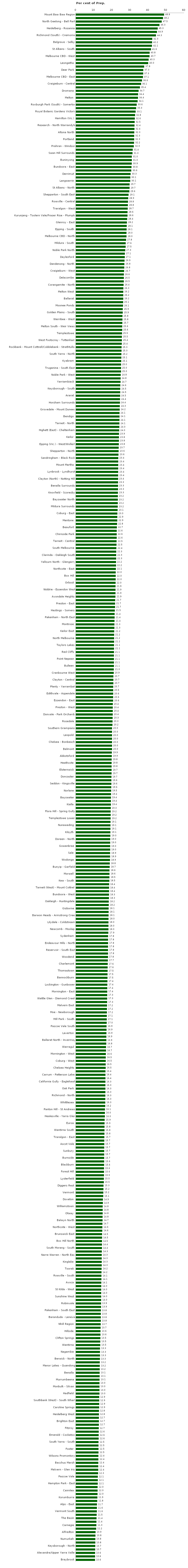
| Category | Series 0 |
|---|---|
| Mount Baw Baw Region | 48.81 |
| Mordialloc - Parkdale/Braeside | 48.214 |
| North Geelong - Bell Park | 47.5 |
| Camperdown | 46.256 |
| Heidelberg - Rosanna | 45.283 |
| Craigieburn - North/Craigieburn - North West | 44.882 |
| Richmond (South) - Cremorne | 44.318 |
| Camberwell | 42.268 |
| Belgrave - Selby | 42.188 |
| Armadale | 42.105 |
| St Albans - South | 41.573 |
| Newport | 40.816 |
| Melbourne CBD - West | 40.741 |
| Shepparton Surrounds - East | 40.254 |
| Leongatha | 40 |
| Castlemaine Surrounds | 37.778 |
| Deer Park | 37.288 |
| Brookfield | 37.255 |
| Melbourne CBD - East | 37.131 |
| Glenroy - West | 36.598 |
| Craigieburn - Central | 36.098 |
| Ararat Surrounds | 35.443 |
| Dromana | 34.694 |
| Springvale South | 34.426 |
| Melton | 34.375 |
| Maryborough Surrounds | 34.146 |
| Roxburgh Park (South) - Somerton | 33.641 |
| Surrey Hills (East) - Mont Albert | 33.333 |
| Royal Botanic Gardens Victoria | 33.058 |
| Mount Dandenong - Olinda | 32.759 |
| Hamilton (Vic.) | 32.609 |
| Hawthorn - North | 32.517 |
| Research - North Warrandyte | 32.432 |
| Werribee - East | 32.418 |
| Altona North | 32.308 |
| West Wodonga | 32.258 |
| Portland | 32.258 |
| St Kilda - Central | 32.178 |
| Prahran - Windsor | 32.039 |
| Maiden Gully | 31.443 |
| Swan Hill Surrounds | 31.325 |
| Meadow Heights | 30.952 |
| Buninyong | 30.952 |
| Dandenong - South | 30.916 |
| Bundoora - East | 30.769 |
| Mount Eliza | 30.645 |
| Derrimut | 30.263 |
| Glen Iris - East | 30.102 |
| Langwarrin | 30.07 |
| Yackandandah | 29.719 |
| St Albans - North | 29.714 |
| Bendigo Surrounds - North | 29.586 |
| Shepparton - South East | 29.148 |
| Dandenong North | 28.947 |
| Rowville - Central | 28.846 |
| Clifton Hill - Alphington | 28.767 |
| Traralgon - West | 28.682 |
| Phillip Island | 28.571 |
| Kurunjang - Toolern Vale/Fraser Rise - Plumpton | 28.571 |
| Carlton North - Princes Hill | 28.378 |
| Glenroy - East | 28.235 |
| Taylors Hill | 28.125 |
| Epping - South | 28.07 |
| Tarneit - South | 28 |
| Melbourne CBD - North | 28 |
| Yea | 27.778 |
| Mildura - South | 27.556 |
| Croydon - West | 27.536 |
| Noble Park North | 27.315 |
| Cranbourne | 27.103 |
| Daylesford | 27.059 |
| Seymour Surrounds | 26.923 |
| Dandenong - North | 26.829 |
| Ormond - Glen Huntly | 26.786 |
| Craigieburn - West | 26.689 |
| Hoppers Crossing - South | 26.556 |
| Delacombe | 26.538 |
| Moira | 26.531 |
| Corangamite - North | 26.389 |
| Sunshine North | 26.271 |
| Melton West | 26.222 |
| Epping - East | 26.22 |
| Ballarat | 26.22 |
| Kensington (Vic.) | 26.144 |
| Moonee Ponds | 26.087 |
| Rochester/Rushworth | 25.926 |
| Golden Plains - South | 25.926 |
| Point Cook - North East | 25.773 |
| Werribee - West | 25.758 |
| Springvale | 25.714 |
| Melton South - Weir Views | 25.641 |
| Thornbury | 25.628 |
| Templestowe | 25.532 |
| Ferntree Gully - North | 25.455 |
| West Footscray - Tottenham | 25.444 |
| Lorne - Anglesea | 25.397 |
| Rockbank - Mount Cottrell/Cobblebank - Strathtulloh | 25.275 |
| Wonthaggi - Inverloch | 25.253 |
| South Yarra - North | 25.17 |
| Colac Surrounds | 25.15 |
| Kyabram | 25.091 |
| Wheelers Hill | 25 |
| Truganina - South East | 25 |
| Flemington Racecourse | 25 |
| Noble Park - West | 24.786 |
| Doncaster East - North | 24.762 |
| Yarriambiack | 24.706 |
| Drouin | 24.576 |
| Keysborough - South | 24.528 |
| Golden Plains - North | 24.528 |
| Ararat | 24.476 |
| Pakenham - North West | 24.409 |
| Horsham Surrounds | 24.39 |
| Tullamarine/Melbourne Airport | 24.289 |
| Grovedale - Mount Duneed | 24.242 |
| Trafalgar (Vic.) | 24.138 |
| Bendigo | 24.138 |
| Cranbourne North - West/Clyde North - South/Clyde North - North/Cranbourne North - East | 24.107 |
| Tarneit - North | 24.065 |
| Castlemaine | 24.042 |
| Highett (East) - Cheltenham | 23.952 |
| Brunswick - North | 23.864 |
| Keilor | 23.83 |
| Brighton (Vic.) | 23.81 |
| Epping (Vic.) - West/Wollert | 23.762 |
| Cranbourne East - North/Cranbourne East - South | 23.676 |
| Shepparton - North | 23.636 |
| Frankston South | 23.556 |
| Sandringham - Black Rock | 23.445 |
| Aspendale Gardens - Waterways | 23.445 |
| Mount Martha | 23.438 |
| Warrandyte - Wonga Park | 23.415 |
| Lynbrook - Lyndhurst | 23.404 |
| Hallam | 23.377 |
| Clayton (North) - Notting Hill | 23.364 |
| Frankston | 23.333 |
| Benalla Surrounds | 23.333 |
| Narre Warren North | 23.313 |
| Knoxfield - Scoresby | 23.256 |
| Mansfield (Vic.) | 23.226 |
| Bayswater North | 23.214 |
| Bundoora - North | 23.171 |
| Mildura Surrounds | 23.153 |
| South Morang - North | 23.077 |
| Coburg - East | 22.951 |
| Werribee - South | 22.917 |
| Mentone | 22.903 |
| Geelong West - Hamlyn Heights | 22.794 |
| Beaufort | 22.672 |
| Craigieburn - South | 22.588 |
| Chirnside Park | 22.581 |
| Airport West/Essendon Airport | 22.581 |
| Tarneit - Central | 22.5 |
| Kyneton | 22.481 |
| South Melbourne | 22.381 |
| Delahey | 22.33 |
| Clarinda - Oakleigh South | 22.293 |
| Doncaster East - South | 22.286 |
| Yallourn North - Glengarry | 22.222 |
| Corangamite - South | 22.222 |
| Northcote - East | 22.115 |
| Horsham | 22.028 |
| Box Hill | 22.026 |
| Pakenham - South West | 22 |
| Orbost | 21.973 |
| Bruthen - Omeo | 21.93 |
| Niddrie - Essendon West | 21.918 |
| Fitzroy North | 21.918 |
| Avondale Heights | 21.875 |
| Loddon | 21.739 |
| Preston - East | 21.687 |
| Sunshine | 21.678 |
| Hastings - Somers | 21.538 |
| South Yarra - West | 21.429 |
| Pakenham - North East | 21.429 |
| Mildura - North | 21.368 |
| Montrose | 21.32 |
| Rosebud - McCrae | 21.311 |
| Keilor East | 21.212 |
| Reservoir - North West | 21.168 |
| North Melbourne | 21.154 |
| Montmorency - Briar Hill | 21.154 |
| Taylors Lakes | 21.101 |
| Hoppers Crossing - North | 21.101 |
| Red Cliffs | 21.081 |
| Truganina - South West | 21.053 |
| Point Nepean | 21.053 |
| Colac | 21.053 |
| Bulleen | 21.053 |
| Upwey - Tecoma | 20.968 |
| Cranbourne West | 20.946 |
| Bright - Mount Beauty | 20.745 |
| Clayton - Central | 20.741 |
| Frankston North | 20.737 |
| Plenty - Yarrambat | 20.661 |
| Yarra Valley | 20.635 |
| Edithvale - Aspendale | 20.635 |
| Corio - Lovely Banks | 20.619 |
| Essendon - East | 20.594 |
| Yarram/Longford - Loch Sport | 20.43 |
| Preston - West | 20.408 |
| Hampton | 20.408 |
| Donvale - Park Orchards | 20.388 |
| Mitcham (Vic.) | 20.325 |
| Rosedale | 20.29 |
| Hampton Park - West | 20.219 |
| Southern Grampians | 20 |
| Smythes Creek | 20 |
| Leopold | 20 |
| Kew East | 20 |
| Chelsea - Bonbeach | 20 |
| Canadian - Mount Clear | 20 |
| Belmont | 20 |
| Kingsbury | 19.886 |
| Abbotsford | 19.857 |
| Lalor - West | 19.792 |
| Heathcote | 19.753 |
| Burwood East | 19.753 |
| Elsternwick | 19.745 |
| Glenelg (Vic.) | 19.731 |
| Doncaster | 19.672 |
| Point Cook - South | 19.635 |
| Seddon - Kingsville | 19.632 |
| Narre Warren South - West | 19.565 |
| Norlane | 19.512 |
| Clayton South | 19.444 |
| Bayswater | 19.403 |
| Sunbury - West | 19.375 |
| Kialla | 19.375 |
| Ringwood | 19.298 |
| Flora Hill - Spring Gully | 19.231 |
| Croydon Hills - Warranwood | 19.231 |
| Templestowe Lower | 19.205 |
| Pearcedale - Tooradin | 19.149 |
| Nunawading | 19.118 |
| Creswick - Clunes | 19.11 |
| Kilsyth | 19.075 |
| Torquay | 19.048 |
| Doreen - North | 18.987 |
| Truganina - North | 18.974 |
| Gowanbrae | 18.966 |
| Collingwood | 18.966 |
| Sale | 18.919 |
| Hughesdale | 18.919 |
| Wodonga | 18.868 |
| Yarraville | 18.75 |
| Bunyip - Garfield | 18.692 |
| Yarrawonga | 18.571 |
| Morwell | 18.571 |
| East Melbourne | 18.543 |
| Kew - South | 18.519 |
| Cranbourne South | 18.4 |
| Tarneit (West) - Mount Cottrell | 18.367 |
| Bentleigh East - South | 18.354 |
| Bundoora - West | 18.333 |
| Gordon (Vic.) | 18.293 |
| Oakleigh - Huntingdale | 18.182 |
| Kerang | 18.182 |
| Gisborne | 18.107 |
| Lalor - East | 18.103 |
| Barwon Heads - Armstrong Creek | 18.072 |
| Endeavour Hills - South | 18.033 |
| Lilydale - Coldstream | 18.023 |
| Kilmore - Broadford | 18.018 |
| Newcomb - Moolap | 18.008 |
| Gladstone Park - Westmeadows | 17.937 |
| Sydenham | 17.808 |
| Reservoir - South West | 17.808 |
| Endeavour Hills - North | 17.797 |
| Lara | 17.785 |
| Reservoir - South East | 17.778 |
| Kings Park (Vic.) | 17.778 |
| Woodend | 17.769 |
| Mickleham - Yuroke | 17.68 |
| Charlemont | 17.61 |
| Churchill | 17.557 |
| Thomastown | 17.544 |
| Ardeer - Albion | 17.5 |
| Bannockburn | 17.48 |
| Ringwood North | 17.442 |
| Lockington - Gunbower | 17.391 |
| Mooroopna | 17.355 |
| Mornington - East | 17.352 |
| Doreen - South | 17.329 |
| Wattle Glen - Diamond Creek | 17.308 |
| Point Lonsdale - Queenscliff | 17.287 |
| Malvern East | 17.219 |
| Ocean Grove | 17.181 |
| Moe - Newborough | 17.157 |
| Balwyn | 17.098 |
| Mill Park - South | 17.073 |
| Seymour | 17.037 |
| Pascoe Vale South | 16.949 |
| Carlton | 16.949 |
| Laverton | 16.883 |
| Narre Warren - South West | 16.854 |
| Ballarat North - Invermay | 16.854 |
| Point Cook - North West | 16.81 |
| Warragul | 16.667 |
| Mill Park - North | 16.667 |
| Mornington - West | 16.564 |
| Mulgrave | 16.514 |
| Coburg - West | 16.514 |
| Footscray | 16.484 |
| Chelsea Heights | 16.477 |
| Skye - Sandhurst | 16.364 |
| Carrum - Patterson Lakes | 16.358 |
| Cobram | 16.352 |
| California Gully - Eaglehawk | 16.34 |
| Somerville | 16.327 |
| Oak Park | 16.327 |
| Eynesbury - Exford | 16.327 |
| Richmond - North | 16.292 |
| Warrnambool - South | 16.268 |
| Whittlesea | 16.256 |
| Berwick - South West | 16.226 |
| Panton Hill - St Andrews | 16.082 |
| Burnside Heights | 16.049 |
| Healesville - Yarra Glen | 16.026 |
| Croydon South | 15.909 |
| Euroa | 15.854 |
| Stawell/St Arnaud | 15.833 |
| Wantirna South | 15.823 |
| Keilor Downs | 15.789 |
| Traralgon - East | 15.741 |
| Wyndham Vale - South | 15.714 |
| Ascot Vale | 15.714 |
| Macedon | 15.686 |
| Sunbury | 15.672 |
| Wandin - Seville | 15.658 |
| Burnside | 15.652 |
| Ringwood East | 15.64 |
| Blackburn | 15.607 |
| Shepparton Surrounds - West | 15.556 |
| Forest Hill | 15.556 |
| Blackburn South | 15.546 |
| Lysterfield | 15.473 |
| Elwood | 15.472 |
| Diggers Rest | 15.271 |
| Ferntree Gully (South) - Upper Ferntree | 15.244 |
| Vermont | 15.179 |
| East Bendigo - Kennington | 15.135 |
| Doveton | 14.943 |
| Alphington - Fairfield | 14.935 |
| Williamstown | 14.815 |
| Romsey | 14.815 |
| Otway | 14.815 |
| Paynesville | 14.754 |
| Balwyn North | 14.744 |
| Highett (West) - Cheltenham | 14.683 |
| Northcote - West | 14.65 |
| Rowville - North | 14.599 |
| Brunswick East | 14.493 |
| Beaconsfield - Officer | 14.493 |
| Box Hill North | 14.451 |
| Strathfieldsaye | 14.423 |
| South Morang - South | 14.423 |
| Berwick - South East | 14.34 |
| Narre Warren - North East | 14.286 |
| Moyne - East | 14.286 |
| Kinglake | 14.286 |
| Caulfield - North | 14.286 |
| Toorak | 14.208 |
| Ashwood - Chadstone | 14.167 |
| Rowville - South | 14.13 |
| Mount Waverley - South | 14.118 |
| Avoca | 14.062 |
| Mernda - North/Mernda - South | 14.035 |
| St Kilda - West | 14 |
| Bentleigh - McKinnon | 14 |
| Sunshine West | 13.986 |
| Beaumaris | 13.953 |
| Robinvale | 13.934 |
| Sebastopol - Redan | 13.918 |
| Pakenham - South East | 13.821 |
| Myrtleford | 13.793 |
| Baranduda - Leneva | 13.793 |
| Ballarat East - Warrenheip | 13.793 |
| Nhill Region | 13.71 |
| White Hills - Ascot | 13.659 |
| Hillside | 13.596 |
| Caulfield - South | 13.58 |
| Clifton Springs | 13.542 |
| Ivanhoe | 13.483 |
| Wantirna | 13.462 |
| Roxburgh Park - North | 13.333 |
| Nagambie | 13.333 |
| Bairnsdale | 13.333 |
| Berwick - North | 13.298 |
| Seaford (Vic.) | 13.208 |
| Manor Lakes - Quandong | 13.208 |
| Sunbury - South | 13.174 |
| Benalla | 13.139 |
| Docklands | 13.131 |
| Murrumbeena | 13.08 |
| Wangaratta | 13.043 |
| Monbulk - Silvan | 13.043 |
| Koo Wee Rup | 13.043 |
| Hadfield | 13.043 |
| Warrnambool - North | 12.903 |
| Southbank (West) - South Wharf | 12.903 |
| Brunswick - South | 12.903 |
| Caroline Springs | 12.883 |
| Brunswick West | 12.766 |
| Heidelberg West | 12.755 |
| Burwood (Vic.) | 12.727 |
| Brighton East | 12.727 |
| Mooroolbark | 12.712 |
| Fitzroy | 12.651 |
| Ashburton (Vic.) | 12.637 |
| Emerald - Cockatoo | 12.593 |
| Altona Meadows | 12.583 |
| South Yarra - South | 12.5 |
| Kew - West | 12.5 |
| Foster | 12.5 |
| Carrum Downs | 12.5 |
| Wilsons Promontory | 12.435 |
| Port Melbourne/Port Melbourne Industrial | 12.422 |
| Bacchus Marsh | 12.403 |
| Wyndham Vale - North | 12.371 |
| Malvern - Glen Iris | 12.371 |
| Wangaratta Surrounds | 12.273 |
| Pascoe Vale | 12.121 |
| Hawthorn East | 12.121 |
| Hampton Park - East | 12.077 |
| Chiltern - Indigo Valley | 12 |
| Cairnlea | 12 |
| Maryborough (Vic.) | 11.966 |
| Korumburra | 11.881 |
| West Melbourne - Industrial | 11.806 |
| Alps - East | 11.65 |
| Strathmore | 11.613 |
| Vermont South | 11.594 |
| St Kilda East | 11.475 |
| The Basin | 11.404 |
| Hurstbridge | 11.364 |
| Carnegie | 11.321 |
| Lake King | 11.215 |
| Alfredton | 10.87 |
| Moyne - West | 10.811 |
| Numurkah | 10.753 |
| Bentleigh East - North | 10.753 |
| Keysborough - North | 10.714 |
| Newtown (Vic.) | 10.662 |
| Alexandra/Upper Yarra Valley | 10.625 |
| Boronia | 10.606 |
| Braybrook | 10.577 |